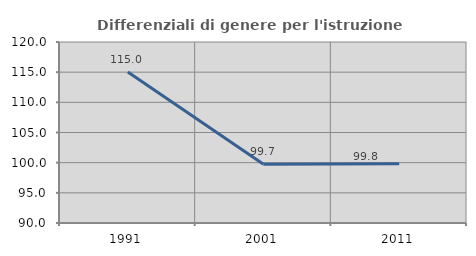
| Category | Differenziali di genere per l'istruzione superiore |
|---|---|
| 1991.0 | 115.034 |
| 2001.0 | 99.723 |
| 2011.0 | 99.831 |